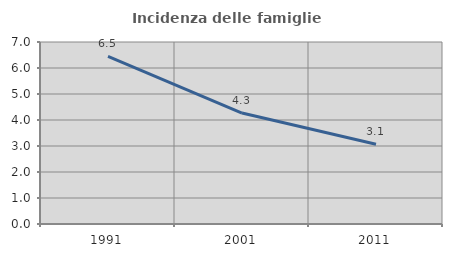
| Category | Incidenza delle famiglie numerose |
|---|---|
| 1991.0 | 6.452 |
| 2001.0 | 4.267 |
| 2011.0 | 3.069 |